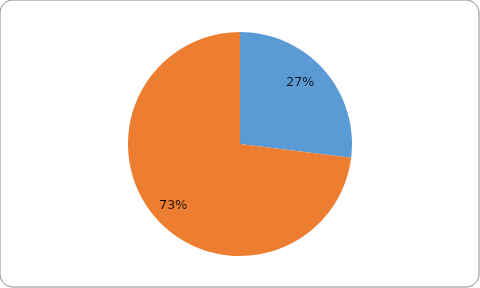
| Category | Series 0 |
|---|---|
| Z toho zahraniční | 96530 |
| Slovensko | 261595 |